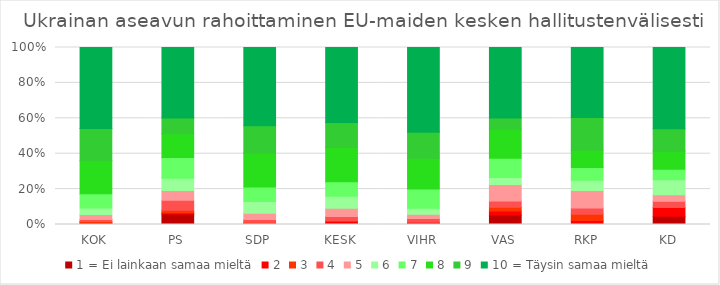
| Category | 1 = Ei lainkaan samaa mieltä | 2 | 3 | 4 | 5 | 6 | 7 | 8 | 9 | 10 = Täysin samaa mieltä |
|---|---|---|---|---|---|---|---|---|---|---|
| KOK | 0.44 | 0.67 | 0.52 | 1.13 | 2.66 | 3.62 | 7.79 | 17.93 | 17.68 | 44.2 |
| PS | 5.55 | 0.65 | 1.29 | 5.39 | 5.19 | 6.45 | 11.05 | 12.48 | 8.37 | 37.4 |
| SDP | 0.48 | 0 | 0.79 | 1.43 | 3.39 | 6.2 | 7.91 | 18.25 | 14.57 | 42.02 |
| KESK | 0.65 | 1.25 | 0 | 2.36 | 4.35 | 6.24 | 7.64 | 18.05 | 13.24 | 39.45 |
| VIHR | 0.57 | 0.57 | 0 | 1.99 | 2.12 | 3.21 | 9.93 | 15.96 | 13.45 | 43.9 |
| VAS | 4.6 | 1.89 | 1.8 | 3.09 | 7.94 | 3.31 | 9.28 | 14.05 | 5.45 | 33.97 |
| RKP | 0 | 1.93 | 3.03 | 3.02 | 8.53 | 5.1 | 6.16 | 8.41 | 15.99 | 34.08 |
| KD | 4.46 | 4.74 | 0 | 3.44 | 3.51 | 8.05 | 5.77 | 9.71 | 12.1 | 44.05 |